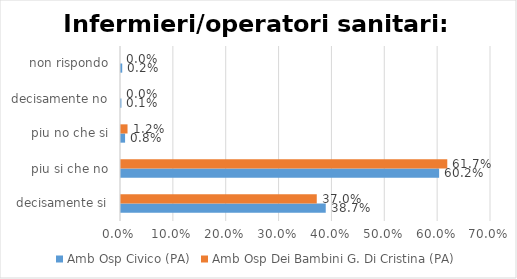
| Category | Amb Osp Civico (PA) | Amb Osp Dei Bambini G. Di Cristina (PA) |
|---|---|---|
| decisamente si | 0.387 | 0.37 |
| piu si che no | 0.602 | 0.617 |
| piu no che si | 0.008 | 0.012 |
| decisamente no | 0.001 | 0 |
| non rispondo | 0.002 | 0 |